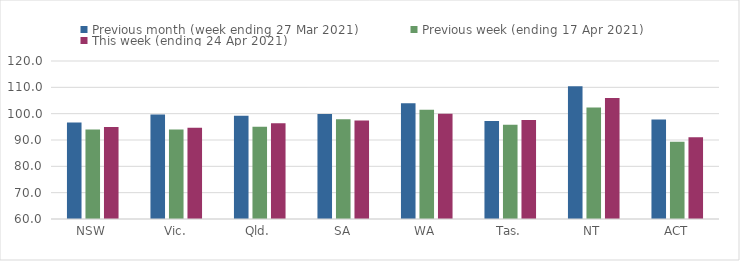
| Category | Previous month (week ending 27 Mar 2021) | Previous week (ending 17 Apr 2021) | This week (ending 24 Apr 2021) |
|---|---|---|---|
| NSW | 96.61 | 93.98 | 94.95 |
| Vic. | 99.66 | 93.95 | 94.67 |
| Qld. | 99.18 | 95.07 | 96.32 |
| SA | 99.87 | 97.91 | 97.42 |
| WA | 103.92 | 101.5 | 99.98 |
| Tas. | 97.25 | 95.8 | 97.57 |
| NT | 110.37 | 102.34 | 105.98 |
| ACT | 97.77 | 89.38 | 91.04 |